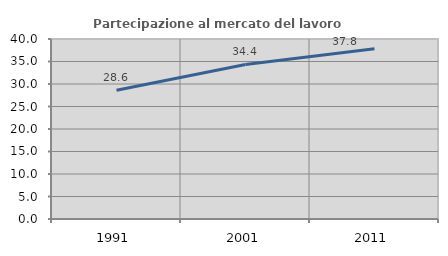
| Category | Partecipazione al mercato del lavoro  femminile |
|---|---|
| 1991.0 | 28.591 |
| 2001.0 | 34.353 |
| 2011.0 | 37.827 |